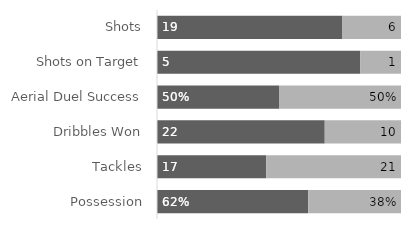
| Category | Liverpool | Manchester United |
|---|---|---|
| Shots | 19 | 6 |
| Shots on Target | 5 | 1 |
| Aerial Duel Success | 0.5 | 0.5 |
| Dribbles Won | 22 | 10 |
| Tackles | 17 | 21 |
| Possession | 0.62 | 0.38 |